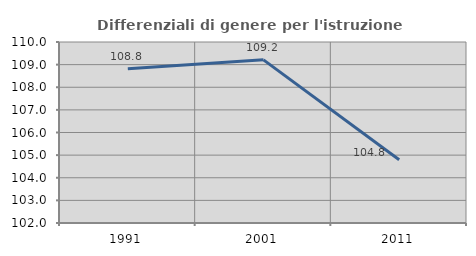
| Category | Differenziali di genere per l'istruzione superiore |
|---|---|
| 1991.0 | 108.823 |
| 2001.0 | 109.212 |
| 2011.0 | 104.794 |